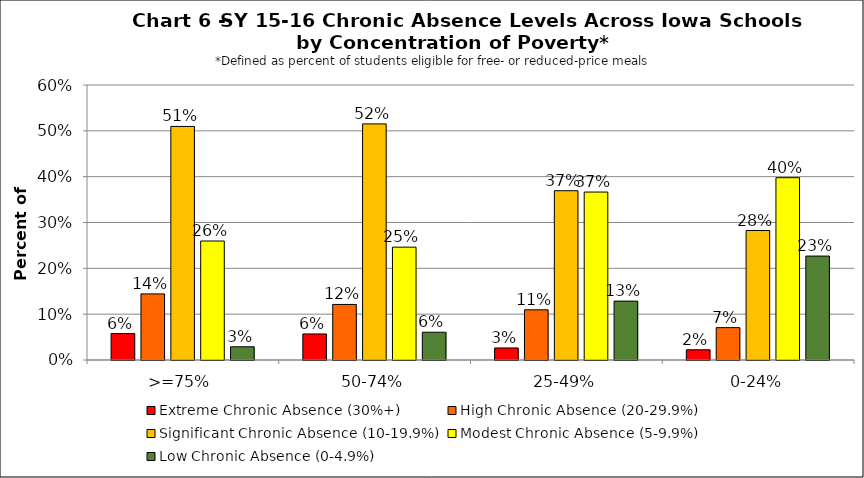
| Category | Extreme Chronic Absence (30%+) | High Chronic Absence (20-29.9%) | Significant Chronic Absence (10-19.9%) | Modest Chronic Absence (5-9.9%) | Low Chronic Absence (0-4.9%) |
|---|---|---|---|---|---|
| 0 | 0.058 | 0.144 | 0.51 | 0.26 | 0.029 |
| 1 | 0.057 | 0.121 | 0.515 | 0.246 | 0.061 |
| 2 | 0.026 | 0.109 | 0.369 | 0.366 | 0.128 |
| 3 | 0.022 | 0.071 | 0.283 | 0.398 | 0.227 |